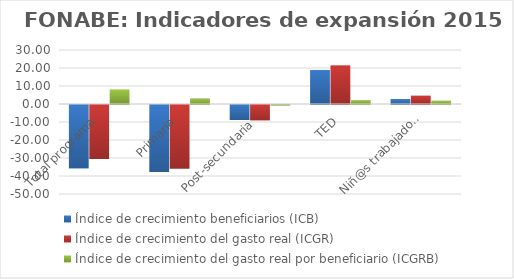
| Category | Índice de crecimiento beneficiarios (ICB)  | Índice de crecimiento del gasto real (ICGR)  | Índice de crecimiento del gasto real por beneficiario (ICGRB)  |
|---|---|---|---|
| Total programa | -35.264 | -30.017 | 8.105 |
| Primaria | -37.276 | -35.372 | 3.036 |
| Post-secundaria  | -8.331 | -8.597 | -0.29 |
| TED | 18.912 | 21.492 | 2.17 |
| Niñ@s trabajadores | 2.761 | 4.632 | 1.82 |